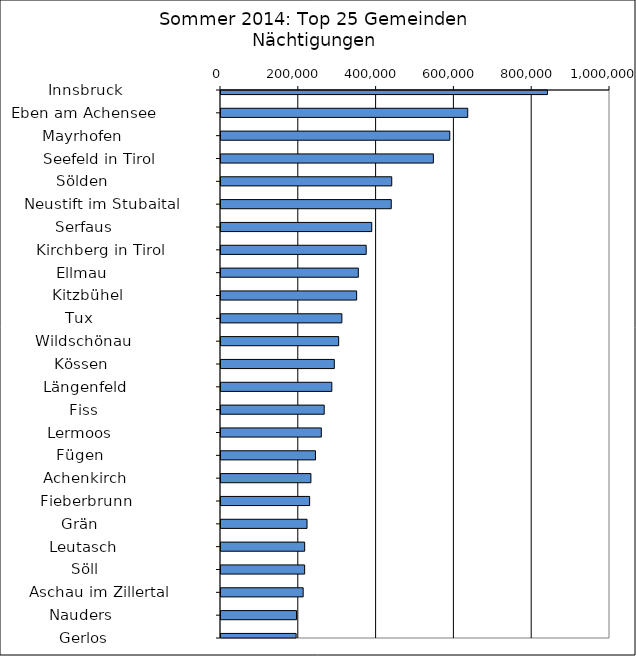
| Category | Series 0 |
|---|---|
|   Innsbruck                  | 839178 |
|   Eben am Achensee           | 634269 |
|   Mayrhofen                  | 588194 |
|   Seefeld in Tirol           | 545940 |
|   Sölden                     | 438945 |
|   Neustift im Stubaital      | 437663 |
|   Serfaus                    | 387532 |
|   Kirchberg in Tirol         | 373268 |
|   Ellmau                     | 353067 |
|   Kitzbühel                  | 348667 |
|   Tux                        | 310705 |
|   Wildschönau                | 302472 |
|   Kössen                     | 291292 |
|   Längenfeld                 | 284932 |
|   Fiss                       | 265326 |
|   Lermoos                    | 257902 |
|   Fügen                      | 242865 |
|   Achenkirch                 | 231138 |
|   Fieberbrunn                | 227856 |
|   Grän                       | 221194 |
|   Leutasch                   | 215100 |
|   Söll                       | 215032 |
|   Aschau im Zillertal        | 211203 |
|   Nauders                    | 194163 |
|   Gerlos                     | 193139 |